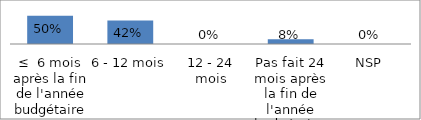
| Category | Series 0 |
|---|---|
| ≤  6 mois après la fin de l'année budgétaire | 0.5 |
| 6 - 12 mois | 0.417 |
| 12 - 24 mois | 0 |
| Pas fait 24 mois après la fin de l'année budgétaire | 0.083 |
| NSP | 0 |